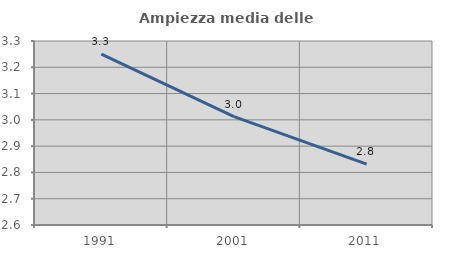
| Category | Ampiezza media delle famiglie |
|---|---|
| 1991.0 | 3.25 |
| 2001.0 | 3.013 |
| 2011.0 | 2.831 |